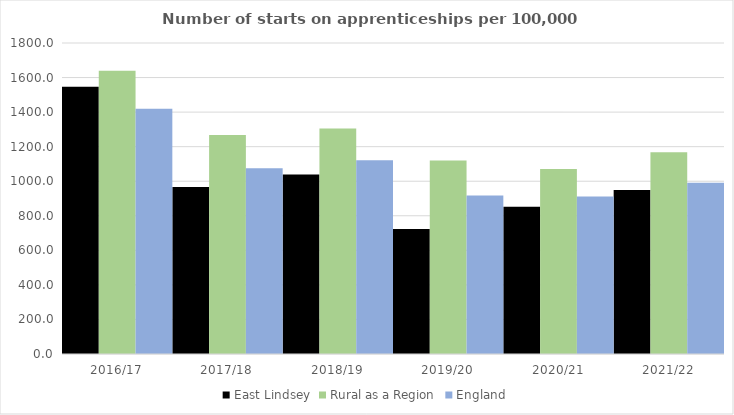
| Category | East Lindsey | Rural as a Region | England |
|---|---|---|---|
| 2016/17 | 1547 | 1638.789 | 1420 |
| 2017/18 | 966 | 1267.474 | 1075 |
| 2018/19 | 1039 | 1304.57 | 1122 |
| 2019/20 | 723 | 1119.662 | 918 |
| 2020/21 | 852 | 1070.748 | 912 |
| 2021/22 | 949 | 1167.68 | 991 |